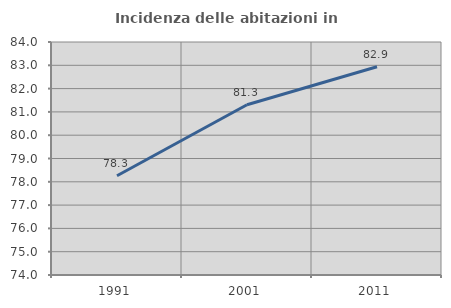
| Category | Incidenza delle abitazioni in proprietà  |
|---|---|
| 1991.0 | 78.261 |
| 2001.0 | 81.305 |
| 2011.0 | 82.938 |